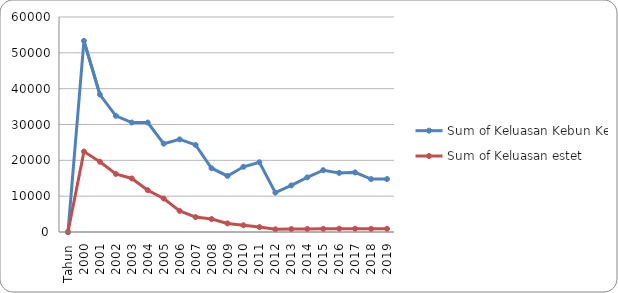
| Category | Sum of Keluasan Kebun Kecil | Sum of Keluasan estet |
|---|---|---|
| Tahun | 0 | 0 |
| 2000 | 53327 | 22439 |
| 2001 | 38358 | 19605 |
| 2002 | 32430 | 16201 |
| 2003 | 30547 | 14946 |
| 2004 | 30547 | 11661 |
| 2005 | 24646 | 9348 |
| 2006 | 25845 | 5895 |
| 2007 | 24296 | 4163 |
| 2008 | 17798 | 3613 |
| 2009 | 15647 | 2400 |
| 2010 | 18203 | 1880 |
| 2011 | 19464 | 1384 |
| 2012 | 10999 | 749 |
| 2013 | 12999 | 827 |
| 2014 | 15243 | 859 |
| 2015 | 17243 | 879 |
| 2016 | 16489 | 932 |
| 2017 | 16639 | 924 |
| 2018 | 14776 | 885 |
| 2019 | 14776 | 885 |